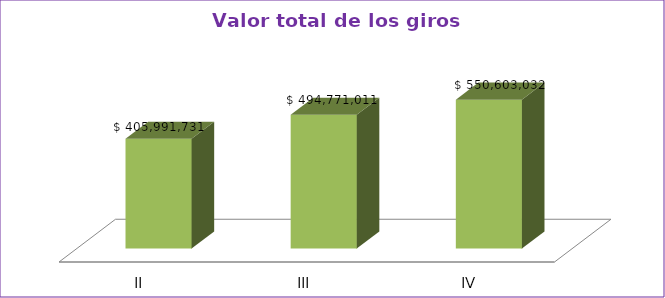
| Category | Series 0 |
|---|---|
| II | 405991731 |
| III | 494771011 |
| IV | 550603032 |